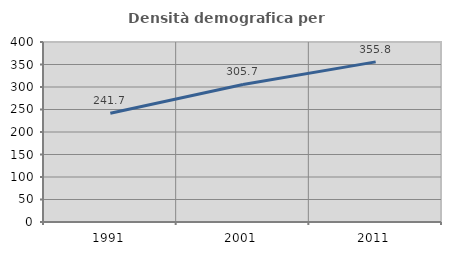
| Category | Densità demografica |
|---|---|
| 1991.0 | 241.665 |
| 2001.0 | 305.706 |
| 2011.0 | 355.842 |